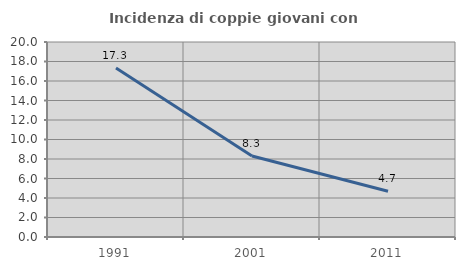
| Category | Incidenza di coppie giovani con figli |
|---|---|
| 1991.0 | 17.343 |
| 2001.0 | 8.314 |
| 2011.0 | 4.693 |